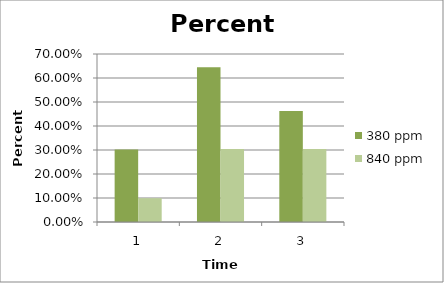
| Category | 380 ppm | 840 ppm |
|---|---|---|
| 0 | 0.302 | 0.099 |
| 1 | 0.645 | 0.304 |
| 2 | 0.463 | 0.304 |